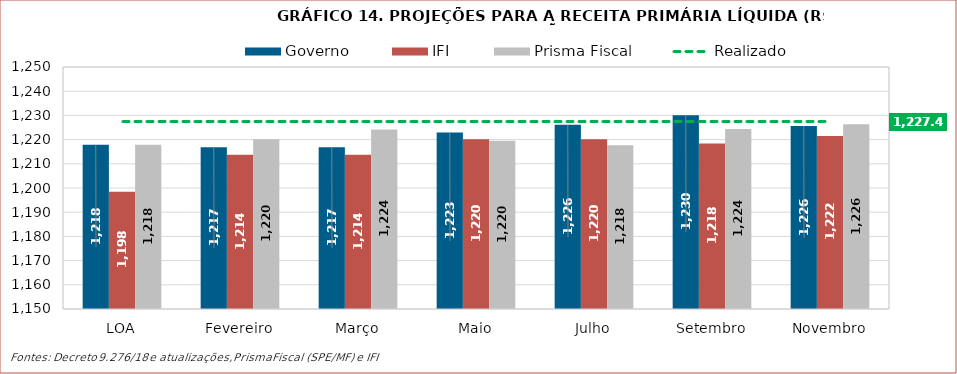
| Category | Governo | IFI | Prisma Fiscal |
|---|---|---|---|
| LOA | 1217.832 | 1198.403 | 1217.831 |
| Fevereiro | 1216.792 | 1213.688 | 1220.148 |
| Março | 1216.852 | 1213.688 | 1224.142 |
| Maio | 1222.917 | 1220.129 | 1219.568 |
| Julho | 1226.11 | 1220.129 | 1217.637 |
| Setembro | 1230.039 | 1218.38 | 1224.427 |
| Novembro | 1225.569 | 1221.511 | 1226.354 |